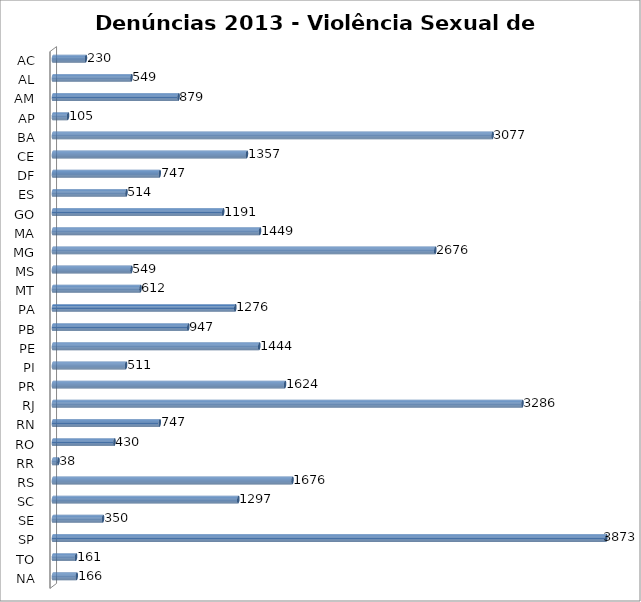
| Category | Series 0 |
|---|---|
| AC | 230 |
| AL | 549 |
| AM | 879 |
| AP | 105 |
| BA | 3077 |
| CE | 1357 |
| DF | 747 |
| ES | 514 |
| GO | 1191 |
| MA | 1449 |
| MG | 2676 |
| MS | 549 |
| MT | 612 |
| PA | 1276 |
| PB | 947 |
| PE | 1444 |
| PI | 511 |
| PR | 1624 |
| RJ | 3286 |
| RN | 747 |
| RO | 430 |
| RR | 38 |
| RS | 1676 |
| SC | 1297 |
| SE | 350 |
| SP | 3873 |
| TO | 161 |
| NA | 166 |